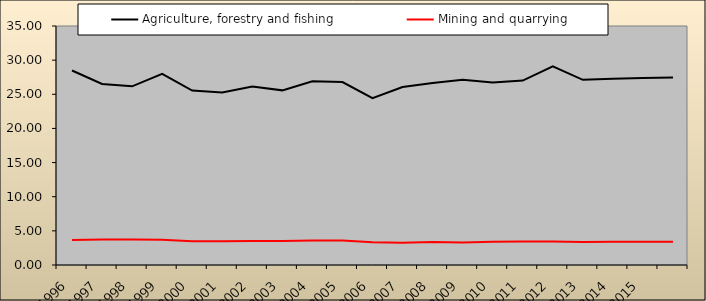
| Category | Agriculture, forestry and fishing | Mining and quarrying |
|---|---|---|
| 1996.0 | 28.484 | 3.651 |
| 1997.0 | 26.516 | 3.749 |
| 1998.0 | 26.163 | 3.727 |
| 1999.0 | 27.99 | 3.68 |
| 2000.0 | 25.552 | 3.481 |
| 2001.0 | 25.256 | 3.493 |
| 2002.0 | 26.135 | 3.523 |
| 2003.0 | 25.574 | 3.5 |
| 2004.0 | 26.909 | 3.584 |
| 2005.0 | 26.787 | 3.602 |
| 2006.0 | 24.433 | 3.342 |
| 2007.0 | 26.064 | 3.25 |
| 2008.0 | 26.66 | 3.352 |
| 2009.0 | 27.142 | 3.309 |
| 2010.0 | 26.739 | 3.394 |
| 2011.0 | 27.001 | 3.457 |
| 2012.0 | 29.095 | 3.451 |
| 2013.0 | 27.117 | 3.369 |
| 2014.0 | 27.292 | 3.389 |
| 2015.0 | 27.398 | 3.395 |